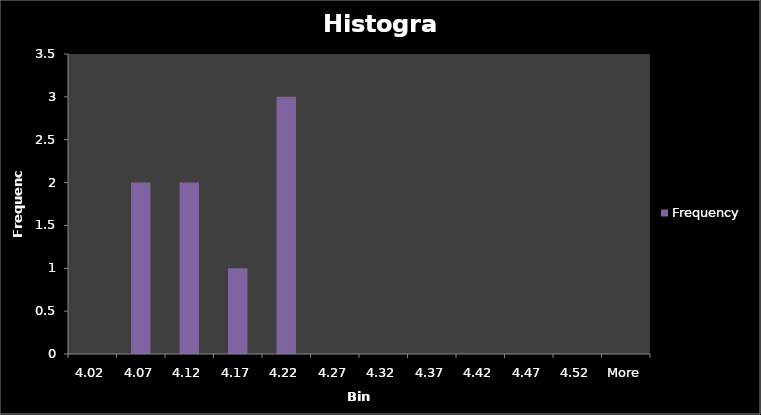
| Category | Frequency |
|---|---|
| 4.02 | 0 |
| 4.07 | 2 |
| 4.12 | 2 |
| 4.17 | 1 |
| 4.22 | 3 |
| 4.27 | 0 |
| 4.32 | 0 |
| 4.37 | 0 |
| 4.42 | 0 |
| 4.47 | 0 |
| 4.52 | 0 |
| More | 0 |